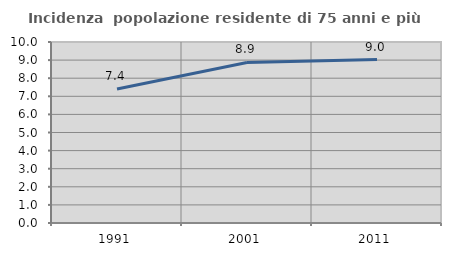
| Category | Incidenza  popolazione residente di 75 anni e più |
|---|---|
| 1991.0 | 7.399 |
| 2001.0 | 8.873 |
| 2011.0 | 9.026 |